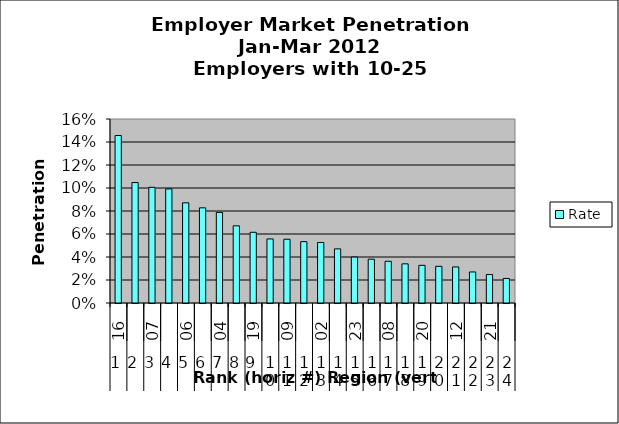
| Category | Rate |
|---|---|
| 0 | 0.146 |
| 1 | 0.105 |
| 2 | 0.101 |
| 3 | 0.099 |
| 4 | 0.087 |
| 5 | 0.083 |
| 6 | 0.079 |
| 7 | 0.067 |
| 8 | 0.061 |
| 9 | 0.056 |
| 10 | 0.055 |
| 11 | 0.053 |
| 12 | 0.053 |
| 13 | 0.047 |
| 14 | 0.04 |
| 15 | 0.038 |
| 16 | 0.036 |
| 17 | 0.034 |
| 18 | 0.033 |
| 19 | 0.032 |
| 20 | 0.031 |
| 21 | 0.027 |
| 22 | 0.025 |
| 23 | 0.021 |